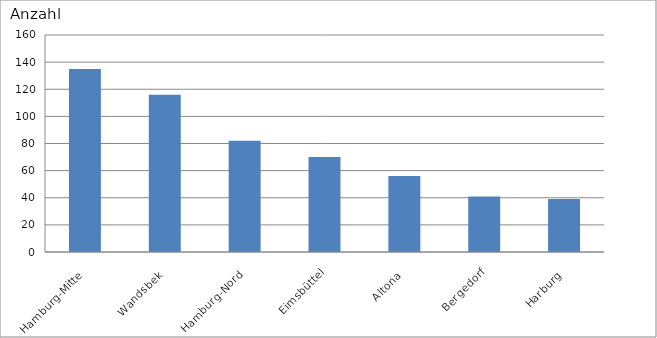
| Category | Hamburg-Mitte Wandsbek Hamburg-Nord Eimsbüttel Altona Bergedorf Harburg |
|---|---|
| Hamburg-Mitte | 135 |
| Wandsbek | 116 |
| Hamburg-Nord | 82 |
| Eimsbüttel | 70 |
| Altona | 56 |
| Bergedorf | 41 |
| Harburg | 39 |